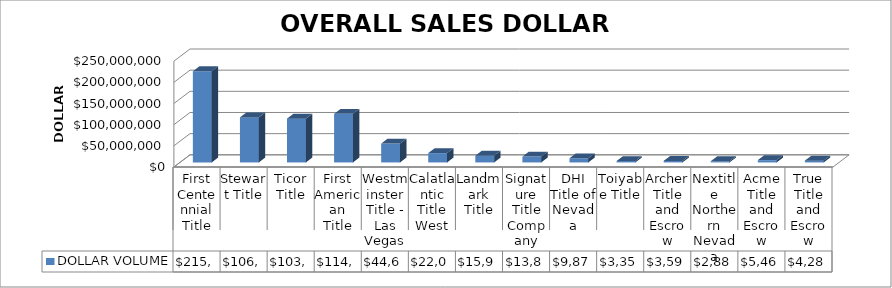
| Category | DOLLAR VOLUME |
|---|---|
| First Centennial Title | 215456444.09 |
| Stewart Title | 106437222.28 |
| Ticor Title | 103508348.43 |
| First American Title | 114822320.77 |
| Westminster Title - Las Vegas | 44607055 |
| Calatlantic Title West | 22059809 |
| Landmark Title | 15985400 |
| Signature Title Company | 13887600 |
| DHI Title of Nevada | 9873580 |
| Toiyabe Title | 3353000 |
| Archer Title and Escrow | 3592800 |
| Nextitle Northern Nevada | 2887500 |
| Acme Title and Escrow | 5467000 |
| True Title and Escrow | 4280000 |